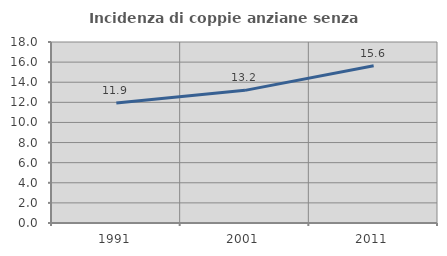
| Category | Incidenza di coppie anziane senza figli  |
|---|---|
| 1991.0 | 11.934 |
| 2001.0 | 13.191 |
| 2011.0 | 15.633 |